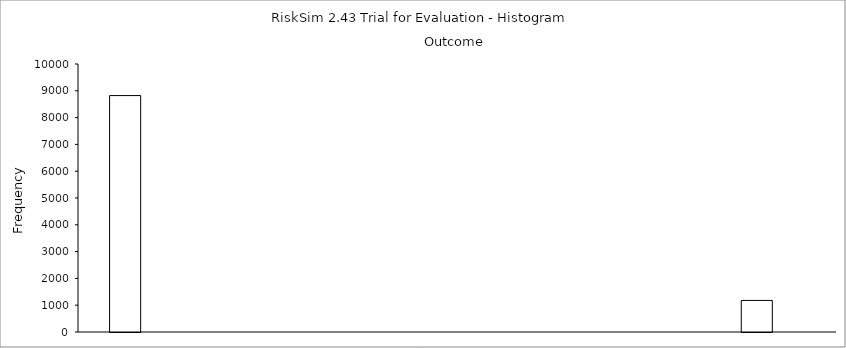
| Category | Series 0 |
|---|---|
| 0 | 0 |
| 1 | 8822 |
| 2 | 0 |
| 3 | 0 |
| 4 | 0 |
| 5 | 0 |
| 6 | 0 |
| 7 | 0 |
| 8 | 0 |
| 9 | 0 |
| 10 | 0 |
| 11 | 0 |
| 12 | 0 |
| 13 | 0 |
| 14 | 0 |
| 15 | 0 |
| 16 | 0 |
| 17 | 0 |
| 18 | 0 |
| 19 | 0 |
| 20 | 0 |
| 21 | 1178 |
| 22 | 0 |
| 23 | 0 |